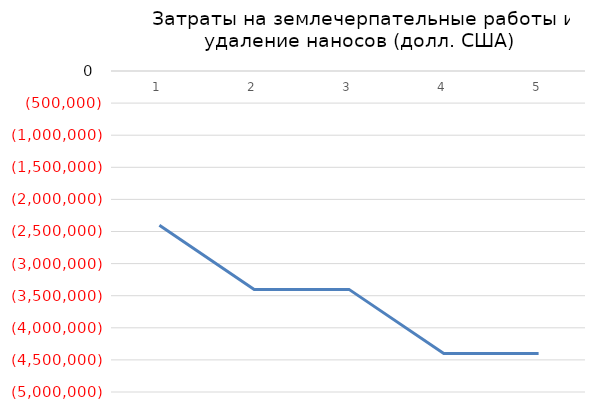
| Category | Series 0 |
|---|---|
| 0 | -2401502.918 |
| 1 | -3401502.918 |
| 2 | -3401502.918 |
| 3 | -4401502.918 |
| 4 | -4401502.918 |